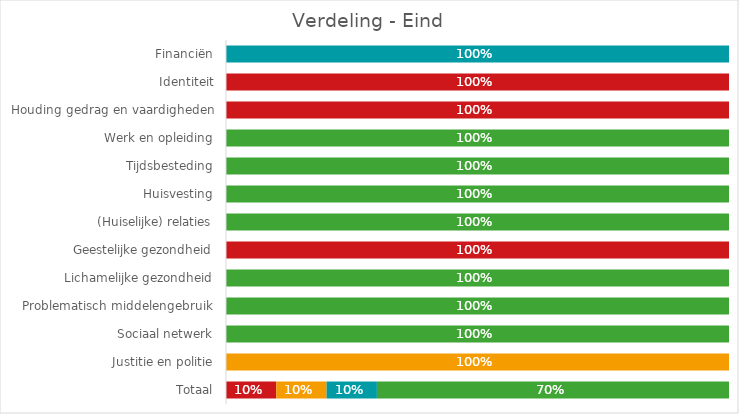
| Category | Series 0 | Series 1 | Series 2 | Series 3 | Series 4 |
|---|---|---|---|---|---|
| Financiën | 0 | 0 | 0 | 1 | 0 |
| Identiteit | 1 | 0 | 0 | 0 | 0 |
| Houding gedrag en vaardigheden | 1 | 0 | 0 | 0 | 0 |
| Werk en opleiding | 0 | 0 | 0 | 0 | 1 |
| Tijdsbesteding | 0 | 0 | 0 | 0 | 1 |
| Huisvesting | 0 | 0 | 0 | 0 | 1 |
| (Huiselijke) relaties | 0 | 0 | 0 | 0 | 1 |
| Geestelijke gezondheid | 1 | 0 | 0 | 0 | 0 |
| Lichamelijke gezondheid | 0 | 0 | 0 | 0 | 1 |
| Problematisch middelengebruik | 0 | 0 | 0 | 0 | 1 |
| Sociaal netwerk | 0 | 0 | 0 | 0 | 1 |
| Justitie en politie | 0 | 0 | 1 | 0 | 0 |
| Totaal | 0.1 | 0 | 0.1 | 0.1 | 0.7 |